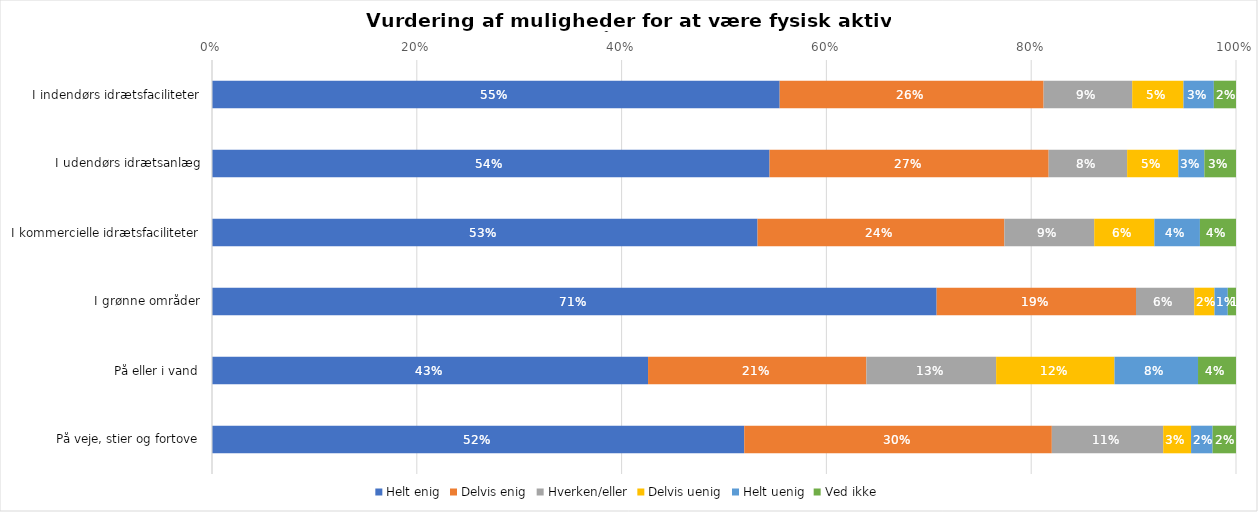
| Category | Helt enig | Delvis enig | Hverken/eller | Delvis uenig | Helt uenig | Ved ikke |
|---|---|---|---|---|---|---|
| I indendørs idrætsfaciliteter | 0.554 | 0.258 | 0.087 | 0.05 | 0.03 | 0.022 |
| I udendørs idrætsanlæg | 0.544 | 0.273 | 0.077 | 0.05 | 0.025 | 0.031 |
| I kommercielle idrætsfaciliteter | 0.533 | 0.241 | 0.088 | 0.059 | 0.044 | 0.035 |
| I grønne områder | 0.708 | 0.195 | 0.057 | 0.02 | 0.013 | 0.008 |
| På eller i vand | 0.426 | 0.213 | 0.127 | 0.116 | 0.082 | 0.037 |
| På veje, stier og fortove | 0.52 | 0.3 | 0.109 | 0.027 | 0.021 | 0.023 |